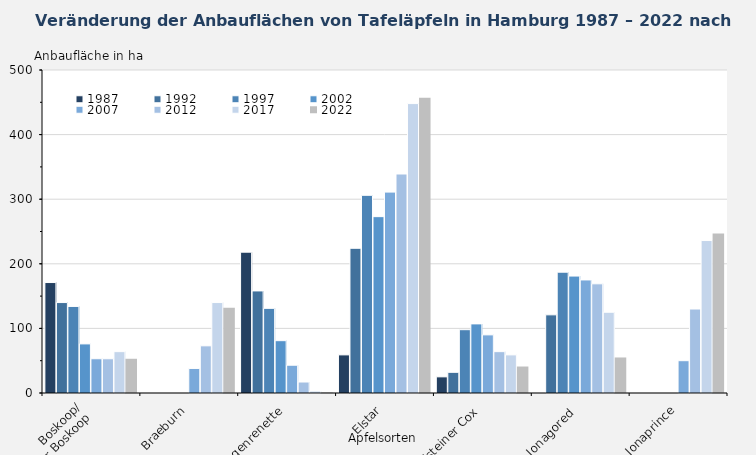
| Category | 1987 | 1992 | 1997 | 2002 | 2007 | 2012 | 2017 | 2022 |
|---|---|---|---|---|---|---|---|---|
| Boskoop/
Roter Boskoop | 171 | 140 | 134 | 76 | 53 | 53 | 64 | 53 |
| Braeburn | 0 | 0 | 0 | 0 | 38 | 73 | 140 | 132 |
| Cox Orangenrenette | 218 | 158 | 131 | 81 | 43 | 17 | 3 | 1 |
| Elstar | 59 | 224 | 306 | 273 | 311 | 339 | 448 | 457 |
| Holsteiner Cox | 25 | 32 | 98 | 107 | 90 | 64 | 59 | 41 |
| Jonagored  | 0 | 121 | 187 | 181 | 175 | 169 | 125 | 55 |
| Jonaprince | 0 | 0 | 0 | 0 | 50 | 130 | 236 | 247 |